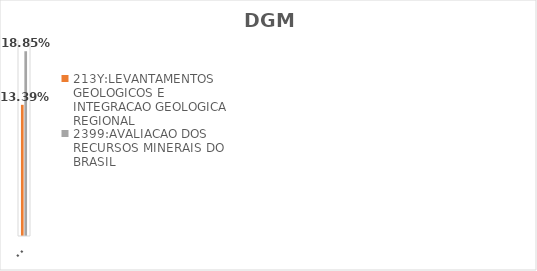
| Category | 213Y:LEVANTAMENTOS GEOLOGICOS E INTEGRACAO GEOLOGICA REGIONAL | 2399:AVALIACAO DOS RECURSOS MINERAIS DO BRASIL |
|---|---|---|
| EXECUTADO | 0.134 | 0.189 |